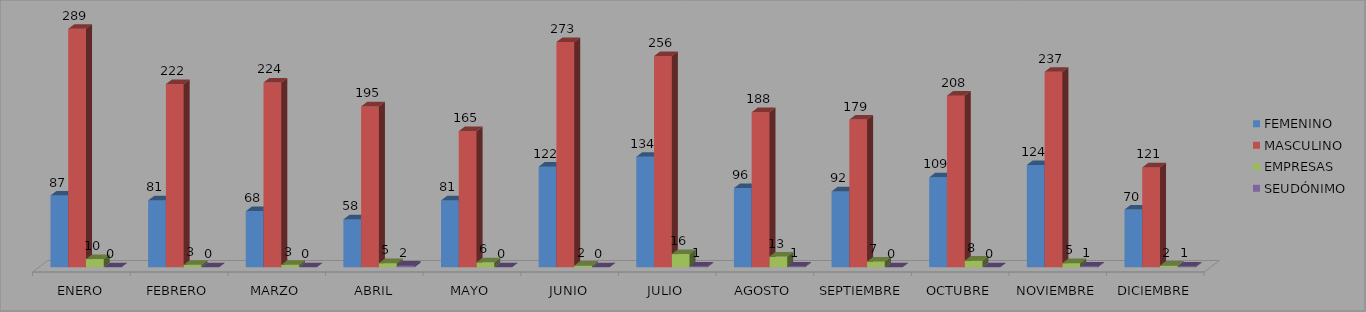
| Category | FEMENINO | MASCULINO | EMPRESAS | SEUDÓNIMO |
|---|---|---|---|---|
| ENERO | 87 | 289 | 10 | 0 |
| FEBRERO | 81 | 222 | 3 | 0 |
| MARZO | 68 | 224 | 3 | 0 |
| ABRIL | 58 | 195 | 5 | 2 |
| MAYO | 81 | 165 | 6 | 0 |
| JUNIO | 122 | 273 | 2 | 0 |
| JULIO | 134 | 256 | 16 | 1 |
| AGOSTO | 96 | 188 | 13 | 1 |
| SEPTIEMBRE | 92 | 179 | 7 | 0 |
| OCTUBRE | 109 | 208 | 8 | 0 |
| NOVIEMBRE | 124 | 237 | 5 | 1 |
| DICIEMBRE | 70 | 121 | 2 | 1 |